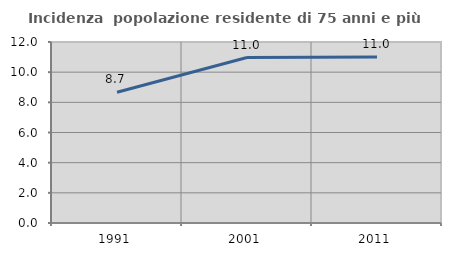
| Category | Incidenza  popolazione residente di 75 anni e più |
|---|---|
| 1991.0 | 8.668 |
| 2001.0 | 10.972 |
| 2011.0 | 11.007 |